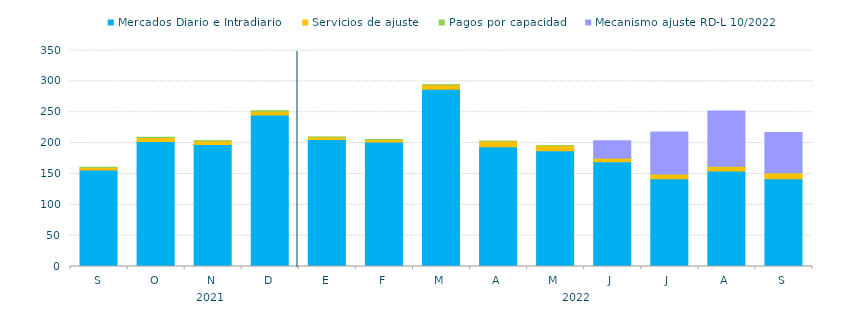
| Category | Mercados Diario e Intradiario  | Servicios de ajuste | Pagos por capacidad | Mecanismo ajuste RD-L 10/2022 |
|---|---|---|---|---|
| S | 156.53 | 3.87 | 0.31 | 0 |
| O | 202.39 | 6.69 | 0.26 | 0 |
| N | 197.49 | 5.94 | 0.38 | 0 |
| D | 245.66 | 5.99 | 0.55 | 0 |
| E | 205.75 | 3.71 | 0.44 | 0 |
| F | 201.85 | 3.39 | 0.46 | 0 |
| M | 287.06 | 6.92 | 0.33 | 0 |
| A | 194.16 | 8.63 | 0.24 | 0 |
| M | 187.74 | 7.84 | 0.23 | 0 |
| J | 169.75 | 6 | 0.25 | 27.64 |
| J | 142.38 | 7.284 | 0.43 | 67.984 |
| A | 154.58 | 7.58 | 0.25 | 89.53 |
| S | 142.21 | 9.54 | 0.25 | 65.19 |